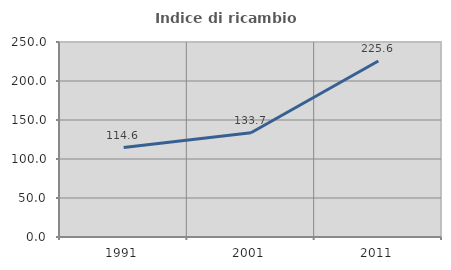
| Category | Indice di ricambio occupazionale  |
|---|---|
| 1991.0 | 114.634 |
| 2001.0 | 133.696 |
| 2011.0 | 225.581 |